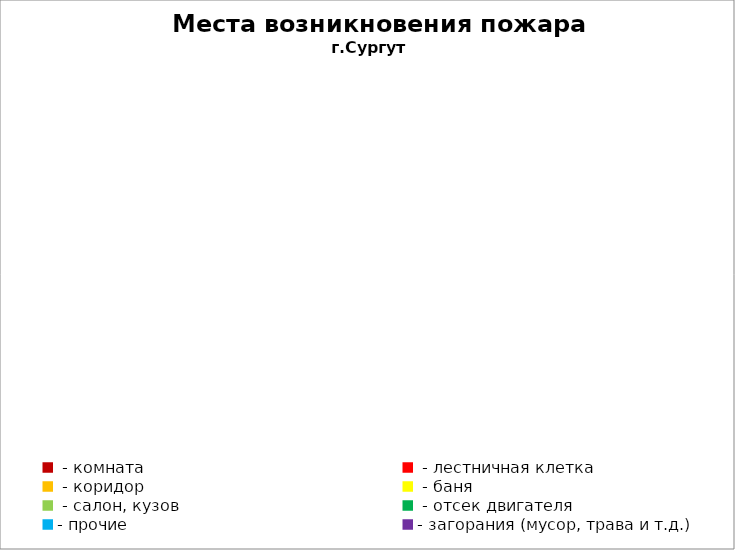
| Category | Места возникновения пожара |
|---|---|
|  - комната | 27 |
|  - лестничная клетка | 2 |
|  - коридор | 2 |
|  - баня | 2 |
|  - салон, кузов | 6 |
|  - отсек двигателя | 10 |
| - прочие | 20 |
| - загорания (мусор, трава и т.д.)  | 15 |